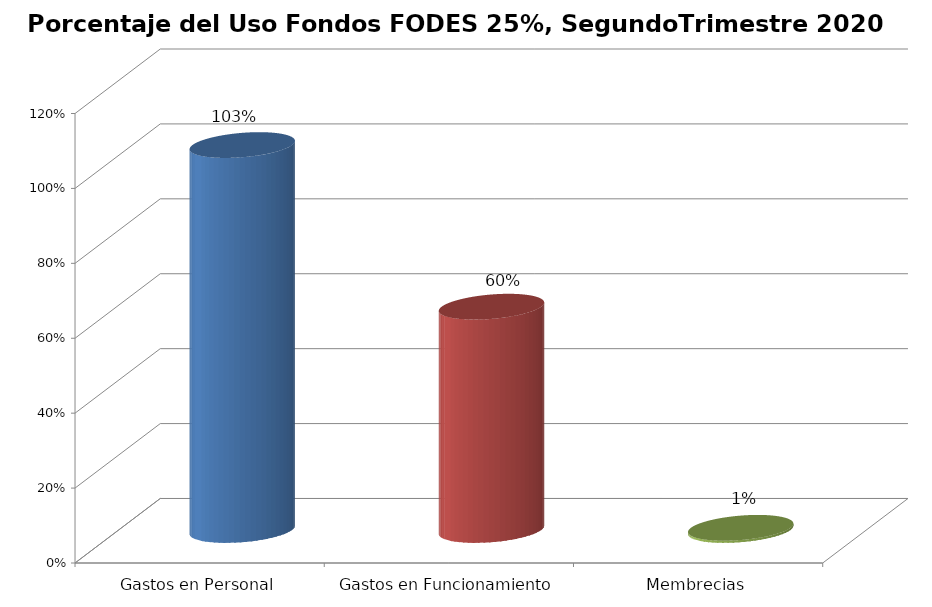
| Category | Series 0 |
|---|---|
|  Gastos en Personal  | 1.028 |
|  Gastos en Funcionamiento  | 0.596 |
|  Membrecias  | 0.006 |